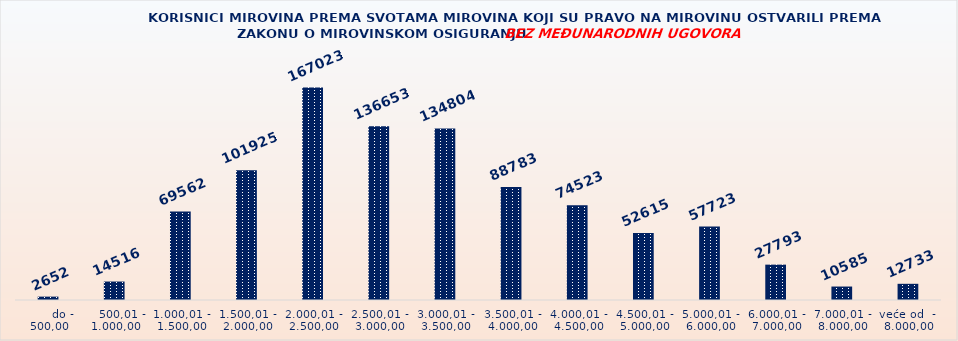
| Category | KORISNICI MIROVINA PREMA VRSTAMA I SVOTAMA MIROVINA KOJI SU PRAVO NA MIROVINU OSTVARILI PREMA ZAKONU O MIROVINSKOM OSIGURANJU 
BEZ MEĐUNARODNIH UGOVORA |
|---|---|
|       do - 500,00 | 2652 |
|    500,01 - 1.000,00 | 14516 |
| 1.000,01 - 1.500,00 | 69562 |
| 1.500,01 - 2.000,00 | 101925 |
| 2.000,01 - 2.500,00 | 167023 |
| 2.500,01 - 3.000,00 | 136653 |
| 3.000,01 - 3.500,00 | 134804 |
| 3.500,01 - 4.000,00 | 88783 |
| 4.000,01 - 4.500,00 | 74523 |
| 4.500,01 - 5.000,00 | 52615 |
| 5.000,01 - 6.000,00 | 57723 |
| 6.000,01 - 7.000,00 | 27793 |
| 7.000,01 - 8.000,00 | 10585 |
| veće od  -  8.000,00 | 12733 |